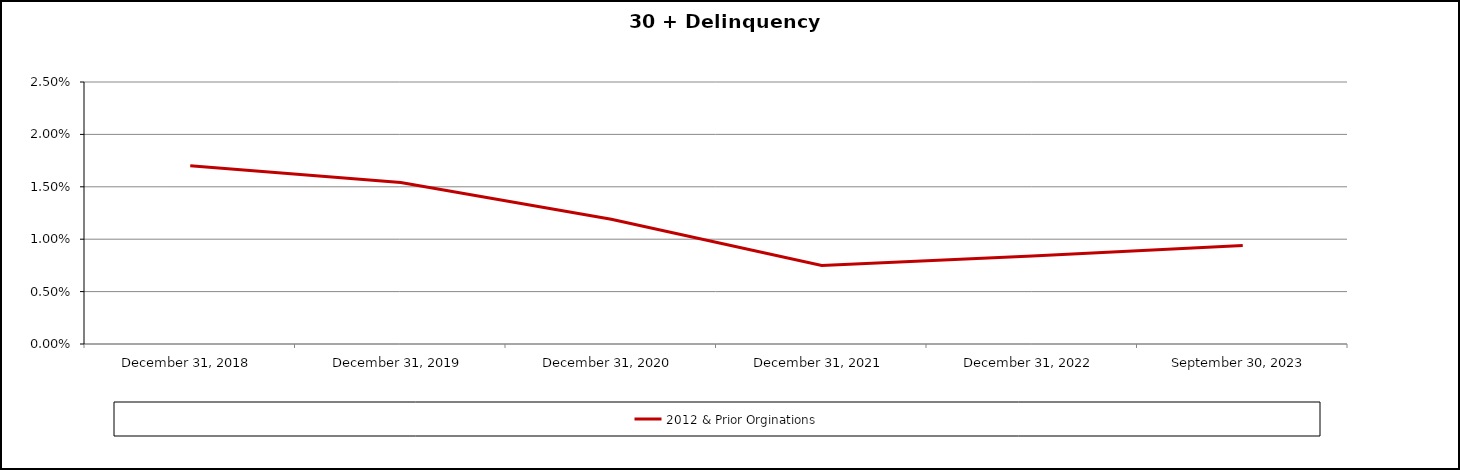
| Category | 2012 & Prior Orginations |
|---|---|
| December 31, 2018 | 0.017 |
| December 31, 2019 | 0.015 |
| December 31, 2020 | 0.012 |
| December 31, 2021 | 0.008 |
| December 31, 2022 | 0.008 |
| September 30, 2023 | 0.009 |